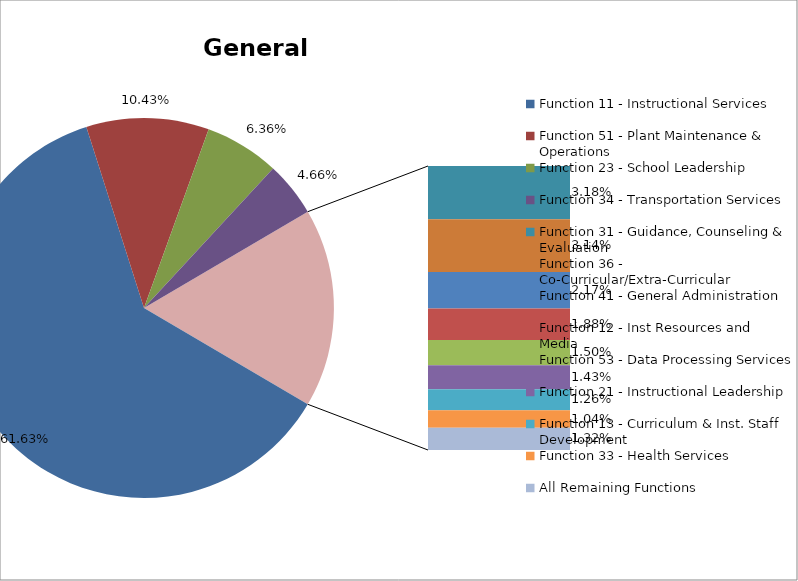
| Category | Series 0 |
|---|---|
| Function 11 - Instructional Services | 0.616 |
| Function 51 - Plant Maintenance & Operations | 0.104 |
| Function 23 - School Leadership | 0.064 |
| Function 34 - Transportation Services | 0.047 |
| Function 31 - Guidance, Counseling & Evaluation | 0.032 |
| Function 36 - Co-Curricular/Extra-Curricular | 0.031 |
| Function 41 - General Administration | 0.022 |
| Function 12 - Inst Resources and Media | 0.019 |
| Function 53 - Data Processing Services | 0.015 |
| Function 21 - Instructional Leadership | 0.014 |
| Function 13 - Curriculum & Inst. Staff Development | 0.013 |
| Function 33 - Health Services | 0.01 |
| All Remaining Functions | 0.013 |